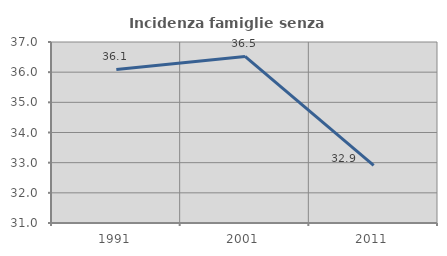
| Category | Incidenza famiglie senza nuclei |
|---|---|
| 1991.0 | 36.089 |
| 2001.0 | 36.52 |
| 2011.0 | 32.909 |